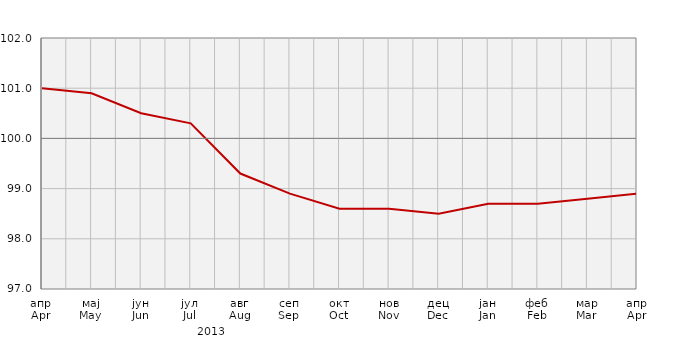
| Category | Индекси цијена произвођача
Producer price indices | Series 1 |
|---|---|---|
| апр
Apr | 101 |  |
| мај
May | 100.9 |  |
| јун
Jun | 100.5 |  |
| јул
Jul | 100.3 |  |
| авг
Aug | 99.3 |  |
| сеп
Sep | 98.9 |  |
| окт
Oct | 98.6 |  |
| нов
Nov | 98.6 |  |
| дец
Dec | 98.5 |  |
| јан
Jan | 98.7 |  |
| феб
Feb | 98.7 |  |
| мар
Mar | 98.8 |  |
| апр
Apr | 98.9 |  |